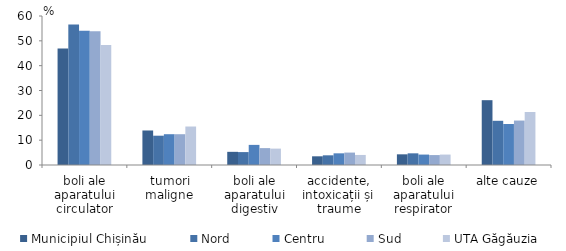
| Category | Municipiul Chișinău | Nord | Centru | Sud | UTA Găgăuzia |
|---|---|---|---|---|---|
| boli ale aparatului circulator | 46.9 | 56.6 | 54.1 | 53.9 | 48.3 |
| tumori maligne | 13.9 | 11.8 | 12.4 | 12.4 | 15.5 |
| boli ale aparatului digestiv | 5.3 | 5.2 | 8.1 | 6.8 | 6.6 |
| accidente, intoxicații și traume | 3.5 | 3.9 | 4.7 | 5 | 4.046 |
| boli ale aparatului respirator | 4.3 | 4.7 | 4.2 | 4 | 4.2 |
| alte cauze | 26.1 | 17.8 | 16.5 | 17.9 | 21.354 |